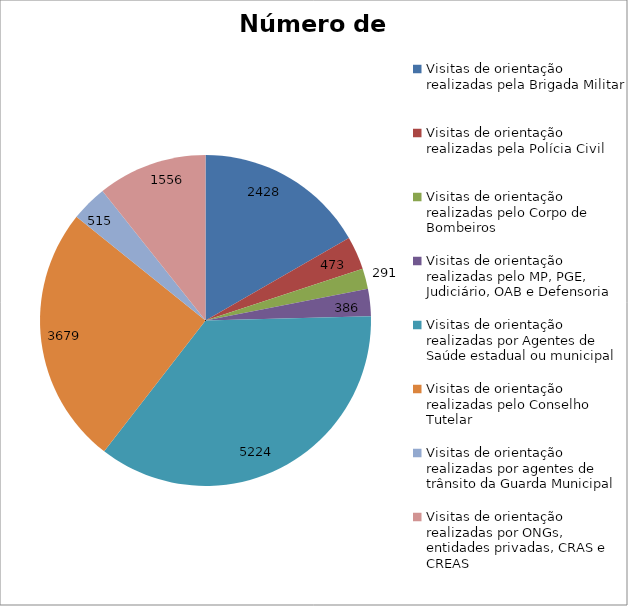
| Category | Número de Ações |
|---|---|
| Visitas de orientação realizadas pela Brigada Militar | 2428 |
| Visitas de orientação realizadas pela Polícia Civil | 473 |
| Visitas de orientação realizadas pelo Corpo de Bombeiros | 291 |
| Visitas de orientação realizadas pelo MP, PGE, Judiciário, OAB e Defensoria | 386 |
| Visitas de orientação realizadas por Agentes de Saúde estadual ou municipal | 5224 |
| Visitas de orientação realizadas pelo Conselho Tutelar | 3679 |
| Visitas de orientação realizadas por agentes de trânsito da Guarda Municipal | 515 |
| Visitas de orientação realizadas por ONGs, entidades privadas, CRAS e CREAS | 1556 |